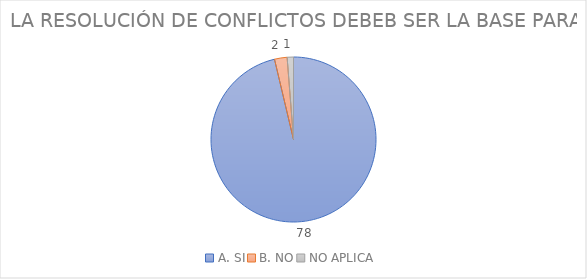
| Category | Series 0 |
|---|---|
| A. SI | 78 |
| B. NO | 2 |
| NO APLICA | 1 |